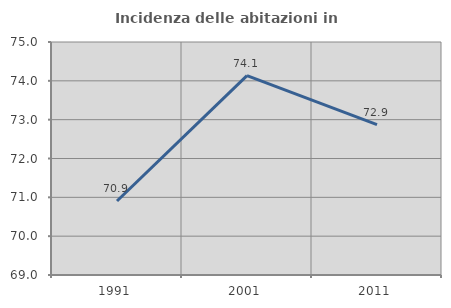
| Category | Incidenza delle abitazioni in proprietà  |
|---|---|
| 1991.0 | 70.905 |
| 2001.0 | 74.133 |
| 2011.0 | 72.872 |